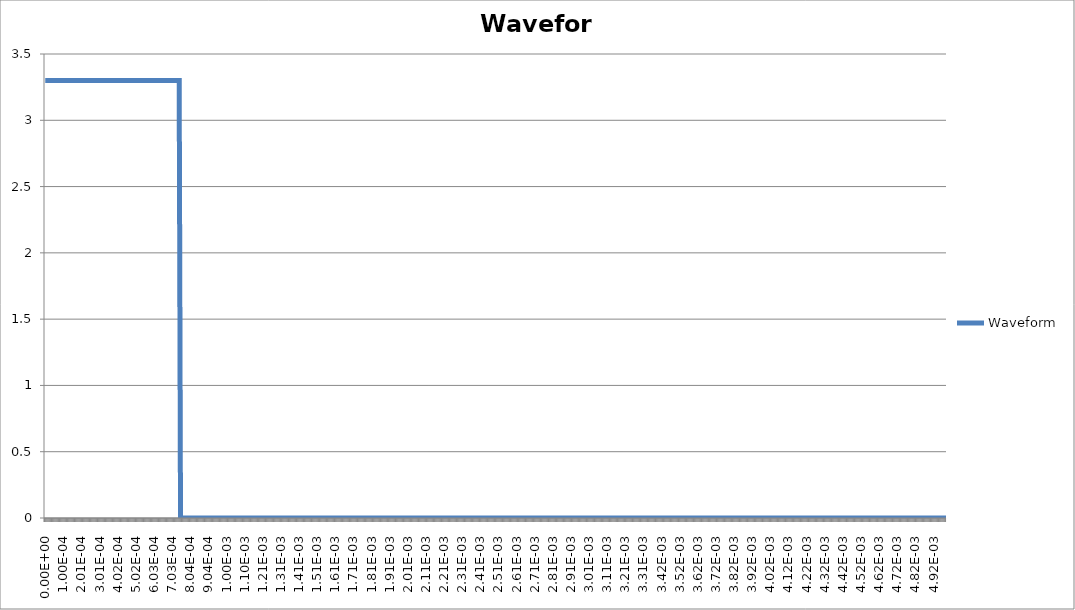
| Category | Waveform |
|---|---|
| 0.0 | 3.3 |
| 2.45e-06 | 3.3 |
| 4.9e-06 | 3.3 |
| 7.35e-06 | 3.3 |
| 9.8e-06 | 3.3 |
| 1.225e-05 | 3.3 |
| 1.47e-05 | 3.3 |
| 1.715e-05 | 3.3 |
| 1.96e-05 | 3.3 |
| 2.205e-05 | 3.3 |
| 2.45e-05 | 3.3 |
| 2.695e-05 | 3.3 |
| 2.94e-05 | 3.3 |
| 3.185e-05 | 3.3 |
| 3.43e-05 | 3.3 |
| 3.675e-05 | 3.3 |
| 3.92e-05 | 3.3 |
| 4.165e-05 | 3.3 |
| 4.41e-05 | 3.3 |
| 4.655e-05 | 3.3 |
| 4.9e-05 | 3.3 |
| 5.145e-05 | 3.3 |
| 5.39e-05 | 3.3 |
| 5.635e-05 | 3.3 |
| 5.88e-05 | 3.3 |
| 6.125e-05 | 3.3 |
| 6.37e-05 | 3.3 |
| 6.615e-05 | 3.3 |
| 6.86e-05 | 3.3 |
| 7.105e-05 | 3.3 |
| 7.35e-05 | 3.3 |
| 7.595e-05 | 3.3 |
| 7.84e-05 | 3.3 |
| 8.085e-05 | 3.3 |
| 8.33e-05 | 3.3 |
| 8.575e-05 | 3.3 |
| 8.82e-05 | 3.3 |
| 9.065e-05 | 3.3 |
| 9.31e-05 | 3.3 |
| 9.555e-05 | 3.3 |
| 9.8e-05 | 3.3 |
| 0.00010045 | 3.3 |
| 0.0001029 | 3.3 |
| 0.00010535 | 3.3 |
| 0.0001078 | 3.3 |
| 0.00011025 | 3.3 |
| 0.0001127 | 3.3 |
| 0.00011515 | 3.3 |
| 0.0001176 | 3.3 |
| 0.00012005 | 3.3 |
| 0.0001225 | 3.3 |
| 0.00012495 | 3.3 |
| 0.0001274 | 3.3 |
| 0.00012985 | 3.3 |
| 0.0001323 | 3.3 |
| 0.00013475 | 3.3 |
| 0.0001372 | 3.3 |
| 0.00013965 | 3.3 |
| 0.0001421 | 3.3 |
| 0.00014455 | 3.3 |
| 0.000147 | 3.3 |
| 0.00014945 | 3.3 |
| 0.0001519 | 3.3 |
| 0.00015435 | 3.3 |
| 0.0001568 | 3.3 |
| 0.00015925 | 3.3 |
| 0.0001617 | 3.3 |
| 0.00016415 | 3.3 |
| 0.0001666 | 3.3 |
| 0.00016905 | 3.3 |
| 0.0001715 | 3.3 |
| 0.00017395 | 3.3 |
| 0.0001764 | 3.3 |
| 0.00017885 | 3.3 |
| 0.0001813 | 3.3 |
| 0.00018375 | 3.3 |
| 0.0001862 | 3.3 |
| 0.00018865 | 3.3 |
| 0.0001911 | 3.3 |
| 0.00019355 | 3.3 |
| 0.000196 | 3.3 |
| 0.00019845 | 3.3 |
| 0.0002009 | 3.3 |
| 0.00020335 | 3.3 |
| 0.0002058 | 3.3 |
| 0.00020825 | 3.3 |
| 0.0002107 | 3.3 |
| 0.00021315 | 3.3 |
| 0.0002156 | 3.3 |
| 0.00021805 | 3.3 |
| 0.0002205 | 3.3 |
| 0.00022295 | 3.3 |
| 0.0002254 | 3.3 |
| 0.00022785 | 3.3 |
| 0.0002303 | 3.3 |
| 0.00023275 | 3.3 |
| 0.0002352 | 3.3 |
| 0.00023765 | 3.3 |
| 0.0002401 | 3.3 |
| 0.00024255 | 3.3 |
| 0.000245 | 3.3 |
| 0.00024745 | 3.3 |
| 0.0002499 | 3.3 |
| 0.00025235 | 3.3 |
| 0.0002548 | 3.3 |
| 0.00025725 | 3.3 |
| 0.0002597 | 3.3 |
| 0.00026215 | 3.3 |
| 0.0002646 | 3.3 |
| 0.00026705 | 3.3 |
| 0.0002695 | 3.3 |
| 0.00027195 | 3.3 |
| 0.0002744 | 3.3 |
| 0.00027685 | 3.3 |
| 0.0002793 | 3.3 |
| 0.00028175 | 3.3 |
| 0.0002842 | 3.3 |
| 0.00028665 | 3.3 |
| 0.0002891 | 3.3 |
| 0.00029155 | 3.3 |
| 0.000294 | 3.3 |
| 0.00029645 | 3.3 |
| 0.0002989 | 3.3 |
| 0.00030135 | 3.3 |
| 0.0003038 | 3.3 |
| 0.00030625 | 3.3 |
| 0.0003087 | 3.3 |
| 0.00031115 | 3.3 |
| 0.0003136 | 3.3 |
| 0.00031605 | 3.3 |
| 0.0003185 | 3.3 |
| 0.00032095 | 3.3 |
| 0.0003234 | 3.3 |
| 0.00032585 | 3.3 |
| 0.0003283 | 3.3 |
| 0.00033075 | 3.3 |
| 0.0003332 | 3.3 |
| 0.00033565 | 3.3 |
| 0.0003381 | 3.3 |
| 0.00034055 | 3.3 |
| 0.000343 | 3.3 |
| 0.00034545 | 3.3 |
| 0.0003479 | 3.3 |
| 0.00035035 | 3.3 |
| 0.0003528 | 3.3 |
| 0.00035525 | 3.3 |
| 0.0003577 | 3.3 |
| 0.00036015 | 3.3 |
| 0.0003626 | 3.3 |
| 0.00036505 | 3.3 |
| 0.0003675 | 3.3 |
| 0.00036995 | 3.3 |
| 0.0003724 | 3.3 |
| 0.00037485 | 3.3 |
| 0.0003773 | 3.3 |
| 0.00037975 | 3.3 |
| 0.0003822 | 3.3 |
| 0.00038465 | 3.3 |
| 0.0003871 | 3.3 |
| 0.00038955 | 3.3 |
| 0.000392 | 3.3 |
| 0.00039445 | 3.3 |
| 0.0003969 | 3.3 |
| 0.00039935 | 3.3 |
| 0.0004018 | 3.3 |
| 0.00040425 | 3.3 |
| 0.0004067 | 3.3 |
| 0.00040915 | 3.3 |
| 0.0004116 | 3.3 |
| 0.00041405 | 3.3 |
| 0.0004165 | 3.3 |
| 0.00041895 | 3.3 |
| 0.0004214 | 3.3 |
| 0.00042385 | 3.3 |
| 0.0004263 | 3.3 |
| 0.00042875 | 3.3 |
| 0.0004312 | 3.3 |
| 0.00043365 | 3.3 |
| 0.0004361 | 3.3 |
| 0.00043855 | 3.3 |
| 0.000441 | 3.3 |
| 0.00044345 | 3.3 |
| 0.0004459 | 3.3 |
| 0.00044835 | 3.3 |
| 0.0004508 | 3.3 |
| 0.00045325 | 3.3 |
| 0.0004557 | 3.3 |
| 0.00045815 | 3.3 |
| 0.0004606 | 3.3 |
| 0.00046305 | 3.3 |
| 0.0004655 | 3.3 |
| 0.00046795 | 3.3 |
| 0.0004704 | 3.3 |
| 0.00047285 | 3.3 |
| 0.0004753 | 3.3 |
| 0.00047775 | 3.3 |
| 0.0004802 | 3.3 |
| 0.00048265 | 3.3 |
| 0.0004851 | 3.3 |
| 0.00048755 | 3.3 |
| 0.00049 | 3.3 |
| 0.00049245 | 3.3 |
| 0.0004949 | 3.3 |
| 0.00049735 | 3.3 |
| 0.0004998 | 3.3 |
| 0.00050225 | 3.3 |
| 0.0005047 | 3.3 |
| 0.00050715 | 3.3 |
| 0.0005096 | 3.3 |
| 0.00051205 | 3.3 |
| 0.0005145 | 3.3 |
| 0.00051695 | 3.3 |
| 0.0005194 | 3.3 |
| 0.00052185 | 3.3 |
| 0.0005243 | 3.3 |
| 0.00052675 | 3.3 |
| 0.0005292 | 3.3 |
| 0.00053165 | 3.3 |
| 0.0005341 | 3.3 |
| 0.00053655 | 3.3 |
| 0.000539 | 3.3 |
| 0.00054145 | 3.3 |
| 0.0005439 | 3.3 |
| 0.00054635 | 3.3 |
| 0.0005488 | 3.3 |
| 0.00055125 | 3.3 |
| 0.0005537 | 3.3 |
| 0.00055615 | 3.3 |
| 0.0005586 | 3.3 |
| 0.00056105 | 3.3 |
| 0.0005635 | 3.3 |
| 0.00056595 | 3.3 |
| 0.0005684 | 3.3 |
| 0.00057085 | 3.3 |
| 0.0005733 | 3.3 |
| 0.00057575 | 3.3 |
| 0.0005782 | 3.3 |
| 0.00058065 | 3.3 |
| 0.0005831 | 3.3 |
| 0.00058555 | 3.3 |
| 0.000588 | 3.3 |
| 0.00059045 | 3.3 |
| 0.0005929 | 3.3 |
| 0.00059535 | 3.3 |
| 0.0005978 | 3.3 |
| 0.00060025 | 3.3 |
| 0.0006027 | 3.3 |
| 0.00060515 | 3.3 |
| 0.0006076 | 3.3 |
| 0.00061005 | 3.3 |
| 0.0006125 | 3.3 |
| 0.00061495 | 3.3 |
| 0.0006174 | 3.3 |
| 0.00061985 | 3.3 |
| 0.0006223 | 3.3 |
| 0.00062475 | 3.3 |
| 0.0006272 | 3.3 |
| 0.00062965 | 3.3 |
| 0.0006321 | 3.3 |
| 0.00063455 | 3.3 |
| 0.000637 | 3.3 |
| 0.00063945 | 3.3 |
| 0.0006419 | 3.3 |
| 0.00064435 | 3.3 |
| 0.0006468 | 3.3 |
| 0.00064925 | 3.3 |
| 0.0006517 | 3.3 |
| 0.00065415 | 3.3 |
| 0.0006566 | 3.3 |
| 0.00065905 | 3.3 |
| 0.0006615 | 3.3 |
| 0.00066395 | 3.3 |
| 0.0006664 | 3.3 |
| 0.00066885 | 3.3 |
| 0.0006713 | 3.3 |
| 0.00067375 | 3.3 |
| 0.0006762 | 3.3 |
| 0.00067865 | 3.3 |
| 0.0006811 | 3.3 |
| 0.00068355 | 3.3 |
| 0.000686 | 3.3 |
| 0.00068845 | 3.3 |
| 0.0006909 | 3.3 |
| 0.00069335 | 3.3 |
| 0.0006958 | 3.3 |
| 0.00069825 | 3.3 |
| 0.0007007 | 3.3 |
| 0.00070315 | 3.3 |
| 0.0007056 | 3.3 |
| 0.00070805 | 3.3 |
| 0.0007105 | 3.3 |
| 0.00071295 | 3.3 |
| 0.0007154 | 3.3 |
| 0.00071785 | 3.3 |
| 0.0007203 | 3.3 |
| 0.00072275 | 3.3 |
| 0.0007252 | 3.3 |
| 0.00072765 | 3.3 |
| 0.0007301 | 3.3 |
| 0.00073255 | 3.3 |
| 0.000735 | 3.3 |
| 0.00073745 | 3.3 |
| 0.0007399 | 3.3 |
| 0.00074235 | 3.3 |
| 0.0007448 | 3.3 |
| 0.00074725 | 3.3 |
| 0.0007497 | 0 |
| 0.00075215 | 0 |
| 0.0007546 | 0 |
| 0.00075705 | 0 |
| 0.0007595 | 0 |
| 0.00076195 | 0 |
| 0.0007644 | 0 |
| 0.00076685 | 0 |
| 0.0007693 | 0 |
| 0.00077175 | 0 |
| 0.0007742 | 0 |
| 0.00077665 | 0 |
| 0.0007791 | 0 |
| 0.00078155 | 0 |
| 0.000784 | 0 |
| 0.00078645 | 0 |
| 0.0007889 | 0 |
| 0.00079135 | 0 |
| 0.0007938 | 0 |
| 0.00079625 | 0 |
| 0.0007987 | 0 |
| 0.00080115 | 0 |
| 0.0008036 | 0 |
| 0.00080605 | 0 |
| 0.0008085 | 0 |
| 0.00081095 | 0 |
| 0.0008134 | 0 |
| 0.00081585 | 0 |
| 0.0008183 | 0 |
| 0.00082075 | 0 |
| 0.0008232 | 0 |
| 0.00082565 | 0 |
| 0.0008281 | 0 |
| 0.00083055 | 0 |
| 0.000833 | 0 |
| 0.00083545 | 0 |
| 0.0008379 | 0 |
| 0.00084035 | 0 |
| 0.0008428 | 0 |
| 0.00084525 | 0 |
| 0.0008477 | 0 |
| 0.00085015 | 0 |
| 0.0008526 | 0 |
| 0.00085505 | 0 |
| 0.0008575 | 0 |
| 0.00085995 | 0 |
| 0.0008624 | 0 |
| 0.00086485 | 0 |
| 0.0008673 | 0 |
| 0.00086975 | 0 |
| 0.0008722 | 0 |
| 0.00087465 | 0 |
| 0.0008771 | 0 |
| 0.00087955 | 0 |
| 0.000882 | 0 |
| 0.00088445 | 0 |
| 0.0008869 | 0 |
| 0.00088935 | 0 |
| 0.0008918 | 0 |
| 0.00089425 | 0 |
| 0.0008967 | 0 |
| 0.00089915 | 0 |
| 0.0009016 | 0 |
| 0.00090405 | 0 |
| 0.0009065 | 0 |
| 0.00090895 | 0 |
| 0.0009114 | 0 |
| 0.00091385 | 0 |
| 0.0009163 | 0 |
| 0.00091875 | 0 |
| 0.0009212 | 0 |
| 0.00092365 | 0 |
| 0.0009261 | 0 |
| 0.00092855 | 0 |
| 0.000931 | 0 |
| 0.00093345 | 0 |
| 0.0009359 | 0 |
| 0.00093835 | 0 |
| 0.0009408 | 0 |
| 0.00094325 | 0 |
| 0.0009457 | 0 |
| 0.00094815 | 0 |
| 0.0009506 | 0 |
| 0.00095305 | 0 |
| 0.0009555 | 0 |
| 0.00095795 | 0 |
| 0.0009604 | 0 |
| 0.00096285 | 0 |
| 0.0009653 | 0 |
| 0.00096775 | 0 |
| 0.0009702 | 0 |
| 0.00097265 | 0 |
| 0.0009751 | 0 |
| 0.00097755 | 0 |
| 0.00098 | 0 |
| 0.00098245 | 0 |
| 0.0009849 | 0 |
| 0.00098735 | 0 |
| 0.0009898 | 0 |
| 0.00099225 | 0 |
| 0.0009947 | 0 |
| 0.00099715 | 0 |
| 0.0009996 | 0 |
| 0.00100205 | 0 |
| 0.0010045 | 0 |
| 0.00100695 | 0 |
| 0.0010094 | 0 |
| 0.00101185 | 0 |
| 0.0010143 | 0 |
| 0.00101675 | 0 |
| 0.0010192 | 0 |
| 0.00102165 | 0 |
| 0.0010241 | 0 |
| 0.00102655 | 0 |
| 0.001029 | 0 |
| 0.00103145 | 0 |
| 0.0010339 | 0 |
| 0.00103635 | 0 |
| 0.0010388 | 0 |
| 0.00104125 | 0 |
| 0.0010437 | 0 |
| 0.00104615 | 0 |
| 0.0010486 | 0 |
| 0.00105105 | 0 |
| 0.0010535 | 0 |
| 0.00105595 | 0 |
| 0.0010584 | 0 |
| 0.00106085 | 0 |
| 0.0010633 | 0 |
| 0.00106575 | 0 |
| 0.0010682 | 0 |
| 0.00107065 | 0 |
| 0.0010731 | 0 |
| 0.00107555 | 0 |
| 0.001078 | 0 |
| 0.00108045 | 0 |
| 0.0010829 | 0 |
| 0.00108535 | 0 |
| 0.0010878 | 0 |
| 0.00109025 | 0 |
| 0.0010927 | 0 |
| 0.00109515 | 0 |
| 0.0010976 | 0 |
| 0.00110005 | 0 |
| 0.0011025 | 0 |
| 0.00110495 | 0 |
| 0.0011074 | 0 |
| 0.00110985 | 0 |
| 0.0011123 | 0 |
| 0.00111475 | 0 |
| 0.0011172 | 0 |
| 0.00111965 | 0 |
| 0.0011221 | 0 |
| 0.00112455 | 0 |
| 0.001127 | 0 |
| 0.00112945 | 0 |
| 0.0011319 | 0 |
| 0.00113435 | 0 |
| 0.0011368 | 0 |
| 0.00113925 | 0 |
| 0.0011417 | 0 |
| 0.00114415 | 0 |
| 0.0011466 | 0 |
| 0.00114905 | 0 |
| 0.0011515 | 0 |
| 0.00115395 | 0 |
| 0.0011564 | 0 |
| 0.00115885 | 0 |
| 0.0011613 | 0 |
| 0.00116375 | 0 |
| 0.0011662 | 0 |
| 0.00116865 | 0 |
| 0.0011711 | 0 |
| 0.00117355 | 0 |
| 0.001176 | 0 |
| 0.00117845 | 0 |
| 0.0011809 | 0 |
| 0.00118335 | 0 |
| 0.0011858 | 0 |
| 0.00118825 | 0 |
| 0.0011907 | 0 |
| 0.00119315 | 0 |
| 0.0011956 | 0 |
| 0.00119805 | 0 |
| 0.0012005 | 0 |
| 0.00120295 | 0 |
| 0.0012054 | 0 |
| 0.00120785 | 0 |
| 0.0012103 | 0 |
| 0.00121275 | 0 |
| 0.0012152 | 0 |
| 0.00121765 | 0 |
| 0.0012201 | 0 |
| 0.00122255 | 0 |
| 0.001225 | 0 |
| 0.00122745 | 0 |
| 0.0012299 | 0 |
| 0.00123235 | 0 |
| 0.0012348 | 0 |
| 0.00123725 | 0 |
| 0.0012397 | 0 |
| 0.00124215 | 0 |
| 0.0012446 | 0 |
| 0.00124705 | 0 |
| 0.0012495 | 0 |
| 0.00125195 | 0 |
| 0.0012544 | 0 |
| 0.00125685 | 0 |
| 0.0012593 | 0 |
| 0.00126175 | 0 |
| 0.0012642 | 0 |
| 0.00126665 | 0 |
| 0.0012691 | 0 |
| 0.00127155 | 0 |
| 0.001274 | 0 |
| 0.00127645 | 0 |
| 0.0012789 | 0 |
| 0.00128135 | 0 |
| 0.0012838 | 0 |
| 0.00128625 | 0 |
| 0.0012887 | 0 |
| 0.00129115 | 0 |
| 0.0012936 | 0 |
| 0.00129605 | 0 |
| 0.0012985 | 0 |
| 0.00130095 | 0 |
| 0.0013034 | 0 |
| 0.00130585 | 0 |
| 0.0013083 | 0 |
| 0.00131075 | 0 |
| 0.0013132 | 0 |
| 0.00131565 | 0 |
| 0.0013181 | 0 |
| 0.00132055 | 0 |
| 0.001323 | 0 |
| 0.00132545 | 0 |
| 0.0013279 | 0 |
| 0.00133035 | 0 |
| 0.0013328 | 0 |
| 0.00133525 | 0 |
| 0.0013377 | 0 |
| 0.00134015 | 0 |
| 0.0013426 | 0 |
| 0.00134505 | 0 |
| 0.0013475 | 0 |
| 0.00134995 | 0 |
| 0.0013524 | 0 |
| 0.00135485 | 0 |
| 0.0013573 | 0 |
| 0.00135975 | 0 |
| 0.0013622 | 0 |
| 0.00136465 | 0 |
| 0.0013671 | 0 |
| 0.00136955 | 0 |
| 0.001372 | 0 |
| 0.00137445 | 0 |
| 0.0013769 | 0 |
| 0.00137935 | 0 |
| 0.0013818 | 0 |
| 0.00138425 | 0 |
| 0.0013867 | 0 |
| 0.00138915 | 0 |
| 0.0013916 | 0 |
| 0.00139405 | 0 |
| 0.0013965 | 0 |
| 0.00139895 | 0 |
| 0.0014014 | 0 |
| 0.00140385 | 0 |
| 0.0014063 | 0 |
| 0.00140875 | 0 |
| 0.0014112 | 0 |
| 0.00141365 | 0 |
| 0.0014161 | 0 |
| 0.00141855 | 0 |
| 0.001421 | 0 |
| 0.00142345 | 0 |
| 0.0014259 | 0 |
| 0.00142835 | 0 |
| 0.0014308 | 0 |
| 0.00143325 | 0 |
| 0.0014357 | 0 |
| 0.00143815 | 0 |
| 0.0014406 | 0 |
| 0.00144305 | 0 |
| 0.0014455 | 0 |
| 0.00144795 | 0 |
| 0.0014504 | 0 |
| 0.00145285 | 0 |
| 0.0014553 | 0 |
| 0.00145775 | 0 |
| 0.0014602 | 0 |
| 0.00146265 | 0 |
| 0.0014651 | 0 |
| 0.00146755 | 0 |
| 0.00147 | 0 |
| 0.00147245 | 0 |
| 0.0014749 | 0 |
| 0.00147735 | 0 |
| 0.0014798 | 0 |
| 0.00148225 | 0 |
| 0.0014847 | 0 |
| 0.00148715 | 0 |
| 0.0014896 | 0 |
| 0.00149205 | 0 |
| 0.0014945 | 0 |
| 0.00149695 | 0 |
| 0.0014994 | 0 |
| 0.00150185 | 0 |
| 0.0015043 | 0 |
| 0.00150675 | 0 |
| 0.0015092 | 0 |
| 0.00151165 | 0 |
| 0.0015141 | 0 |
| 0.00151655 | 0 |
| 0.001519 | 0 |
| 0.00152145 | 0 |
| 0.0015239 | 0 |
| 0.00152635 | 0 |
| 0.0015288 | 0 |
| 0.00153125 | 0 |
| 0.0015337 | 0 |
| 0.00153615 | 0 |
| 0.0015386 | 0 |
| 0.00154105 | 0 |
| 0.0015435 | 0 |
| 0.00154595 | 0 |
| 0.0015484 | 0 |
| 0.00155085 | 0 |
| 0.0015533 | 0 |
| 0.00155575 | 0 |
| 0.0015582 | 0 |
| 0.00156065 | 0 |
| 0.0015631 | 0 |
| 0.00156555 | 0 |
| 0.001568 | 0 |
| 0.00157045 | 0 |
| 0.0015729 | 0 |
| 0.00157535 | 0 |
| 0.0015778 | 0 |
| 0.00158025 | 0 |
| 0.0015827 | 0 |
| 0.00158515 | 0 |
| 0.0015876 | 0 |
| 0.00159005 | 0 |
| 0.0015925 | 0 |
| 0.00159495 | 0 |
| 0.0015974 | 0 |
| 0.00159985 | 0 |
| 0.0016023 | 0 |
| 0.00160475 | 0 |
| 0.0016072 | 0 |
| 0.00160965 | 0 |
| 0.0016121 | 0 |
| 0.00161455 | 0 |
| 0.001617 | 0 |
| 0.00161945 | 0 |
| 0.0016219 | 0 |
| 0.00162435 | 0 |
| 0.0016268 | 0 |
| 0.00162925 | 0 |
| 0.0016317 | 0 |
| 0.00163415 | 0 |
| 0.0016366 | 0 |
| 0.00163905 | 0 |
| 0.0016415 | 0 |
| 0.00164395 | 0 |
| 0.0016464 | 0 |
| 0.00164885 | 0 |
| 0.0016513 | 0 |
| 0.00165375 | 0 |
| 0.0016562 | 0 |
| 0.00165865 | 0 |
| 0.0016611 | 0 |
| 0.00166355 | 0 |
| 0.001666 | 0 |
| 0.00166845 | 0 |
| 0.0016709 | 0 |
| 0.00167335 | 0 |
| 0.0016758 | 0 |
| 0.00167825 | 0 |
| 0.0016807 | 0 |
| 0.00168315 | 0 |
| 0.0016856 | 0 |
| 0.00168805 | 0 |
| 0.0016905 | 0 |
| 0.00169295 | 0 |
| 0.0016954 | 0 |
| 0.00169785 | 0 |
| 0.0017003 | 0 |
| 0.00170275 | 0 |
| 0.0017052 | 0 |
| 0.00170765 | 0 |
| 0.0017101 | 0 |
| 0.00171255 | 0 |
| 0.001715 | 0 |
| 0.00171745 | 0 |
| 0.0017199 | 0 |
| 0.00172235 | 0 |
| 0.0017248 | 0 |
| 0.00172725 | 0 |
| 0.0017297 | 0 |
| 0.00173215 | 0 |
| 0.0017346 | 0 |
| 0.00173705 | 0 |
| 0.0017395 | 0 |
| 0.00174195 | 0 |
| 0.0017444 | 0 |
| 0.00174685 | 0 |
| 0.0017493 | 0 |
| 0.00175175 | 0 |
| 0.0017542 | 0 |
| 0.00175665 | 0 |
| 0.0017591 | 0 |
| 0.00176155 | 0 |
| 0.001764 | 0 |
| 0.00176645 | 0 |
| 0.0017689 | 0 |
| 0.00177135 | 0 |
| 0.0017738 | 0 |
| 0.00177625 | 0 |
| 0.0017787 | 0 |
| 0.00178115 | 0 |
| 0.0017836 | 0 |
| 0.00178605 | 0 |
| 0.0017885 | 0 |
| 0.00179095 | 0 |
| 0.0017934 | 0 |
| 0.00179585 | 0 |
| 0.0017983 | 0 |
| 0.00180075 | 0 |
| 0.0018032 | 0 |
| 0.00180565 | 0 |
| 0.0018081 | 0 |
| 0.00181055 | 0 |
| 0.001813 | 0 |
| 0.00181545 | 0 |
| 0.0018179 | 0 |
| 0.00182035 | 0 |
| 0.0018228 | 0 |
| 0.00182525 | 0 |
| 0.0018277 | 0 |
| 0.00183015 | 0 |
| 0.0018326 | 0 |
| 0.00183505 | 0 |
| 0.0018375 | 0 |
| 0.00183995 | 0 |
| 0.0018424 | 0 |
| 0.00184485 | 0 |
| 0.0018473 | 0 |
| 0.00184975 | 0 |
| 0.0018522 | 0 |
| 0.00185465 | 0 |
| 0.0018571 | 0 |
| 0.00185955 | 0 |
| 0.001862 | 0 |
| 0.00186445 | 0 |
| 0.0018669 | 0 |
| 0.00186935 | 0 |
| 0.0018718 | 0 |
| 0.00187425 | 0 |
| 0.0018767 | 0 |
| 0.00187915 | 0 |
| 0.0018816 | 0 |
| 0.00188405 | 0 |
| 0.0018865 | 0 |
| 0.00188895 | 0 |
| 0.0018914 | 0 |
| 0.00189385 | 0 |
| 0.0018963 | 0 |
| 0.00189875 | 0 |
| 0.0019012 | 0 |
| 0.00190365 | 0 |
| 0.0019061 | 0 |
| 0.00190855 | 0 |
| 0.001911 | 0 |
| 0.00191345 | 0 |
| 0.0019159 | 0 |
| 0.00191835 | 0 |
| 0.0019208 | 0 |
| 0.00192325 | 0 |
| 0.0019257 | 0 |
| 0.00192815 | 0 |
| 0.0019306 | 0 |
| 0.00193305 | 0 |
| 0.0019355 | 0 |
| 0.00193795 | 0 |
| 0.0019404 | 0 |
| 0.00194285 | 0 |
| 0.0019453 | 0 |
| 0.00194775 | 0 |
| 0.0019502 | 0 |
| 0.00195265 | 0 |
| 0.0019551 | 0 |
| 0.00195755 | 0 |
| 0.00196 | 0 |
| 0.00196245 | 0 |
| 0.0019649 | 0 |
| 0.00196735 | 0 |
| 0.0019698 | 0 |
| 0.00197225 | 0 |
| 0.0019747 | 0 |
| 0.00197715 | 0 |
| 0.0019796 | 0 |
| 0.00198205 | 0 |
| 0.0019845 | 0 |
| 0.00198695 | 0 |
| 0.0019894 | 0 |
| 0.00199185 | 0 |
| 0.0019943 | 0 |
| 0.00199675 | 0 |
| 0.0019992 | 0 |
| 0.00200165 | 0 |
| 0.0020041 | 0 |
| 0.00200655 | 0 |
| 0.002009 | 0 |
| 0.00201145 | 0 |
| 0.0020139 | 0 |
| 0.00201635 | 0 |
| 0.0020188 | 0 |
| 0.00202125 | 0 |
| 0.0020237 | 0 |
| 0.00202615 | 0 |
| 0.0020286 | 0 |
| 0.00203105 | 0 |
| 0.0020335 | 0 |
| 0.00203595 | 0 |
| 0.0020384 | 0 |
| 0.00204085 | 0 |
| 0.0020433 | 0 |
| 0.00204575 | 0 |
| 0.0020482 | 0 |
| 0.00205065 | 0 |
| 0.0020531 | 0 |
| 0.00205555 | 0 |
| 0.002058 | 0 |
| 0.00206045 | 0 |
| 0.0020629 | 0 |
| 0.00206535 | 0 |
| 0.0020678 | 0 |
| 0.00207025 | 0 |
| 0.0020727 | 0 |
| 0.00207515 | 0 |
| 0.0020776 | 0 |
| 0.00208005 | 0 |
| 0.0020825 | 0 |
| 0.00208495 | 0 |
| 0.0020874 | 0 |
| 0.00208985 | 0 |
| 0.0020923 | 0 |
| 0.00209475 | 0 |
| 0.0020972 | 0 |
| 0.00209965 | 0 |
| 0.0021021 | 0 |
| 0.00210455 | 0 |
| 0.002107 | 0 |
| 0.00210945 | 0 |
| 0.0021119 | 0 |
| 0.00211435 | 0 |
| 0.0021168 | 0 |
| 0.00211925 | 0 |
| 0.0021217 | 0 |
| 0.00212415 | 0 |
| 0.0021266 | 0 |
| 0.00212905 | 0 |
| 0.0021315 | 0 |
| 0.00213395 | 0 |
| 0.0021364 | 0 |
| 0.00213885 | 0 |
| 0.0021413 | 0 |
| 0.00214375 | 0 |
| 0.0021462 | 0 |
| 0.00214865 | 0 |
| 0.0021511 | 0 |
| 0.00215355 | 0 |
| 0.002156 | 0 |
| 0.00215845 | 0 |
| 0.0021609 | 0 |
| 0.00216335 | 0 |
| 0.0021658 | 0 |
| 0.00216825 | 0 |
| 0.0021707 | 0 |
| 0.00217315 | 0 |
| 0.0021756 | 0 |
| 0.00217805 | 0 |
| 0.0021805 | 0 |
| 0.00218295 | 0 |
| 0.0021854 | 0 |
| 0.00218785 | 0 |
| 0.0021903 | 0 |
| 0.00219275 | 0 |
| 0.0021952 | 0 |
| 0.00219765 | 0 |
| 0.0022001 | 0 |
| 0.00220255 | 0 |
| 0.002205 | 0 |
| 0.00220745 | 0 |
| 0.0022099 | 0 |
| 0.00221235 | 0 |
| 0.0022148 | 0 |
| 0.00221725 | 0 |
| 0.0022197 | 0 |
| 0.00222215 | 0 |
| 0.0022246 | 0 |
| 0.00222705 | 0 |
| 0.0022295 | 0 |
| 0.00223195 | 0 |
| 0.0022344 | 0 |
| 0.00223685 | 0 |
| 0.0022393 | 0 |
| 0.00224175 | 0 |
| 0.0022442 | 0 |
| 0.00224665 | 0 |
| 0.0022491 | 0 |
| 0.00225155 | 0 |
| 0.002254 | 0 |
| 0.00225645 | 0 |
| 0.0022589 | 0 |
| 0.00226135 | 0 |
| 0.0022638 | 0 |
| 0.00226625 | 0 |
| 0.0022687 | 0 |
| 0.00227115 | 0 |
| 0.0022736 | 0 |
| 0.00227605 | 0 |
| 0.0022785 | 0 |
| 0.00228095 | 0 |
| 0.0022834 | 0 |
| 0.00228585 | 0 |
| 0.0022883 | 0 |
| 0.00229075 | 0 |
| 0.0022932 | 0 |
| 0.00229565 | 0 |
| 0.0022981 | 0 |
| 0.00230055 | 0 |
| 0.002303 | 0 |
| 0.00230545 | 0 |
| 0.0023079 | 0 |
| 0.00231035 | 0 |
| 0.0023128 | 0 |
| 0.00231525 | 0 |
| 0.0023177 | 0 |
| 0.00232015 | 0 |
| 0.0023226 | 0 |
| 0.00232505 | 0 |
| 0.0023275 | 0 |
| 0.00232995 | 0 |
| 0.0023324 | 0 |
| 0.00233485 | 0 |
| 0.0023373 | 0 |
| 0.00233975 | 0 |
| 0.0023422 | 0 |
| 0.00234465 | 0 |
| 0.0023471 | 0 |
| 0.00234955 | 0 |
| 0.002352 | 0 |
| 0.00235445 | 0 |
| 0.0023569 | 0 |
| 0.00235935 | 0 |
| 0.0023618 | 0 |
| 0.00236425 | 0 |
| 0.0023667 | 0 |
| 0.00236915 | 0 |
| 0.0023716 | 0 |
| 0.00237405 | 0 |
| 0.0023765 | 0 |
| 0.00237895 | 0 |
| 0.0023814 | 0 |
| 0.00238385 | 0 |
| 0.0023863 | 0 |
| 0.00238875 | 0 |
| 0.0023912 | 0 |
| 0.00239365 | 0 |
| 0.0023961 | 0 |
| 0.00239855 | 0 |
| 0.002401 | 0 |
| 0.00240345 | 0 |
| 0.0024059 | 0 |
| 0.00240835 | 0 |
| 0.0024108 | 0 |
| 0.00241325 | 0 |
| 0.0024157 | 0 |
| 0.00241815 | 0 |
| 0.0024206 | 0 |
| 0.00242305 | 0 |
| 0.0024255 | 0 |
| 0.00242795 | 0 |
| 0.0024304 | 0 |
| 0.00243285 | 0 |
| 0.0024353 | 0 |
| 0.00243775 | 0 |
| 0.0024402 | 0 |
| 0.00244265 | 0 |
| 0.0024451 | 0 |
| 0.00244755 | 0 |
| 0.00245 | 0 |
| 0.00245245 | 0 |
| 0.0024549 | 0 |
| 0.00245735 | 0 |
| 0.0024598 | 0 |
| 0.00246225 | 0 |
| 0.0024647 | 0 |
| 0.00246715 | 0 |
| 0.0024696 | 0 |
| 0.00247205 | 0 |
| 0.0024745 | 0 |
| 0.00247695 | 0 |
| 0.0024794 | 0 |
| 0.00248185 | 0 |
| 0.0024843 | 0 |
| 0.00248675 | 0 |
| 0.0024892 | 0 |
| 0.00249165 | 0 |
| 0.0024941 | 0 |
| 0.00249655 | 0 |
| 0.002499 | 0 |
| 0.00250145 | 0 |
| 0.0025039 | 0 |
| 0.00250635 | 0 |
| 0.0025088 | 0 |
| 0.00251125 | 0 |
| 0.0025137 | 0 |
| 0.00251615 | 0 |
| 0.0025186 | 0 |
| 0.00252105 | 0 |
| 0.0025235 | 0 |
| 0.00252595 | 0 |
| 0.0025284 | 0 |
| 0.00253085 | 0 |
| 0.0025333 | 0 |
| 0.00253575 | 0 |
| 0.0025382 | 0 |
| 0.00254065 | 0 |
| 0.0025431 | 0 |
| 0.00254555 | 0 |
| 0.002548 | 0 |
| 0.00255045 | 0 |
| 0.0025529 | 0 |
| 0.00255535 | 0 |
| 0.0025578 | 0 |
| 0.00256025 | 0 |
| 0.0025627 | 0 |
| 0.00256515 | 0 |
| 0.0025676 | 0 |
| 0.00257005 | 0 |
| 0.0025725 | 0 |
| 0.00257495 | 0 |
| 0.0025774 | 0 |
| 0.00257985 | 0 |
| 0.0025823 | 0 |
| 0.00258475 | 0 |
| 0.0025872 | 0 |
| 0.00258965 | 0 |
| 0.0025921 | 0 |
| 0.00259455 | 0 |
| 0.002597 | 0 |
| 0.00259945 | 0 |
| 0.0026019 | 0 |
| 0.00260435 | 0 |
| 0.0026068 | 0 |
| 0.00260925 | 0 |
| 0.0026117 | 0 |
| 0.00261415 | 0 |
| 0.0026166 | 0 |
| 0.00261905 | 0 |
| 0.0026215 | 0 |
| 0.00262395 | 0 |
| 0.0026264 | 0 |
| 0.00262885 | 0 |
| 0.0026313 | 0 |
| 0.00263375 | 0 |
| 0.0026362 | 0 |
| 0.00263865 | 0 |
| 0.0026411 | 0 |
| 0.00264355 | 0 |
| 0.002646 | 0 |
| 0.00264845 | 0 |
| 0.0026509 | 0 |
| 0.00265335 | 0 |
| 0.0026558 | 0 |
| 0.00265825 | 0 |
| 0.0026607 | 0 |
| 0.00266315 | 0 |
| 0.0026656 | 0 |
| 0.00266805 | 0 |
| 0.0026705 | 0 |
| 0.00267295 | 0 |
| 0.0026754 | 0 |
| 0.00267785 | 0 |
| 0.0026803 | 0 |
| 0.00268275 | 0 |
| 0.0026852 | 0 |
| 0.00268765 | 0 |
| 0.0026901 | 0 |
| 0.00269255 | 0 |
| 0.002695 | 0 |
| 0.00269745 | 0 |
| 0.0026999 | 0 |
| 0.00270235 | 0 |
| 0.0027048 | 0 |
| 0.00270725 | 0 |
| 0.0027097 | 0 |
| 0.00271215 | 0 |
| 0.0027146 | 0 |
| 0.00271705 | 0 |
| 0.0027195 | 0 |
| 0.00272195 | 0 |
| 0.0027244 | 0 |
| 0.00272685 | 0 |
| 0.0027293 | 0 |
| 0.00273175 | 0 |
| 0.0027342 | 0 |
| 0.00273665 | 0 |
| 0.0027391 | 0 |
| 0.00274155 | 0 |
| 0.002744 | 0 |
| 0.00274645 | 0 |
| 0.0027489 | 0 |
| 0.00275135 | 0 |
| 0.0027538 | 0 |
| 0.00275625 | 0 |
| 0.0027587 | 0 |
| 0.00276115 | 0 |
| 0.0027636 | 0 |
| 0.00276605 | 0 |
| 0.0027685 | 0 |
| 0.00277095 | 0 |
| 0.0027734 | 0 |
| 0.00277585 | 0 |
| 0.0027783 | 0 |
| 0.00278075 | 0 |
| 0.0027832 | 0 |
| 0.00278565 | 0 |
| 0.0027881 | 0 |
| 0.00279055 | 0 |
| 0.002793 | 0 |
| 0.00279545 | 0 |
| 0.0027979 | 0 |
| 0.00280035 | 0 |
| 0.0028028 | 0 |
| 0.00280525 | 0 |
| 0.0028077 | 0 |
| 0.00281015 | 0 |
| 0.0028126 | 0 |
| 0.00281505 | 0 |
| 0.0028175 | 0 |
| 0.00281995 | 0 |
| 0.0028224 | 0 |
| 0.00282485 | 0 |
| 0.0028273 | 0 |
| 0.00282975 | 0 |
| 0.0028322 | 0 |
| 0.00283465 | 0 |
| 0.0028371 | 0 |
| 0.00283955 | 0 |
| 0.002842 | 0 |
| 0.00284445 | 0 |
| 0.0028469 | 0 |
| 0.00284935 | 0 |
| 0.0028518 | 0 |
| 0.00285425 | 0 |
| 0.0028567 | 0 |
| 0.00285915 | 0 |
| 0.0028616 | 0 |
| 0.00286405 | 0 |
| 0.0028665 | 0 |
| 0.00286895 | 0 |
| 0.0028714 | 0 |
| 0.00287385 | 0 |
| 0.0028763 | 0 |
| 0.00287875 | 0 |
| 0.0028812 | 0 |
| 0.00288365 | 0 |
| 0.0028861 | 0 |
| 0.00288855 | 0 |
| 0.002891 | 0 |
| 0.00289345 | 0 |
| 0.0028959 | 0 |
| 0.00289835 | 0 |
| 0.0029008 | 0 |
| 0.00290325 | 0 |
| 0.0029057 | 0 |
| 0.00290815 | 0 |
| 0.0029106 | 0 |
| 0.00291305 | 0 |
| 0.0029155 | 0 |
| 0.00291795 | 0 |
| 0.0029204 | 0 |
| 0.00292285 | 0 |
| 0.0029253 | 0 |
| 0.00292775 | 0 |
| 0.0029302 | 0 |
| 0.00293265 | 0 |
| 0.0029351 | 0 |
| 0.00293755 | 0 |
| 0.00294 | 0 |
| 0.00294245 | 0 |
| 0.0029449 | 0 |
| 0.00294735 | 0 |
| 0.0029498 | 0 |
| 0.00295225 | 0 |
| 0.0029547 | 0 |
| 0.00295715 | 0 |
| 0.0029596 | 0 |
| 0.00296205 | 0 |
| 0.0029645 | 0 |
| 0.00296695 | 0 |
| 0.0029694 | 0 |
| 0.00297185 | 0 |
| 0.0029743 | 0 |
| 0.00297675 | 0 |
| 0.0029792 | 0 |
| 0.00298165 | 0 |
| 0.0029841 | 0 |
| 0.00298655 | 0 |
| 0.002989 | 0 |
| 0.00299145 | 0 |
| 0.0029939 | 0 |
| 0.00299635 | 0 |
| 0.0029988 | 0 |
| 0.00300125 | 0 |
| 0.0030037 | 0 |
| 0.00300615 | 0 |
| 0.0030086 | 0 |
| 0.00301105 | 0 |
| 0.0030135 | 0 |
| 0.00301595 | 0 |
| 0.0030184 | 0 |
| 0.00302085 | 0 |
| 0.0030233 | 0 |
| 0.00302575 | 0 |
| 0.0030282 | 0 |
| 0.00303065 | 0 |
| 0.0030331 | 0 |
| 0.00303555 | 0 |
| 0.003038 | 0 |
| 0.00304045 | 0 |
| 0.0030429 | 0 |
| 0.00304535 | 0 |
| 0.0030478 | 0 |
| 0.00305025 | 0 |
| 0.0030527 | 0 |
| 0.00305515 | 0 |
| 0.0030576 | 0 |
| 0.00306005 | 0 |
| 0.0030625 | 0 |
| 0.00306495 | 0 |
| 0.0030674 | 0 |
| 0.00306985 | 0 |
| 0.0030723 | 0 |
| 0.00307475 | 0 |
| 0.0030772 | 0 |
| 0.00307965 | 0 |
| 0.0030821 | 0 |
| 0.00308455 | 0 |
| 0.003087 | 0 |
| 0.00308945 | 0 |
| 0.0030919 | 0 |
| 0.00309435 | 0 |
| 0.0030968 | 0 |
| 0.00309925 | 0 |
| 0.0031017 | 0 |
| 0.00310415 | 0 |
| 0.0031066 | 0 |
| 0.00310905 | 0 |
| 0.0031115 | 0 |
| 0.00311395 | 0 |
| 0.0031164 | 0 |
| 0.00311885 | 0 |
| 0.0031213 | 0 |
| 0.00312375 | 0 |
| 0.0031262 | 0 |
| 0.00312865 | 0 |
| 0.0031311 | 0 |
| 0.00313355 | 0 |
| 0.003136 | 0 |
| 0.00313845 | 0 |
| 0.0031409 | 0 |
| 0.00314335 | 0 |
| 0.0031458 | 0 |
| 0.00314825 | 0 |
| 0.0031507 | 0 |
| 0.00315315 | 0 |
| 0.0031556 | 0 |
| 0.00315805 | 0 |
| 0.0031605 | 0 |
| 0.00316295 | 0 |
| 0.0031654 | 0 |
| 0.00316785 | 0 |
| 0.0031703 | 0 |
| 0.00317275 | 0 |
| 0.0031752 | 0 |
| 0.00317765 | 0 |
| 0.0031801 | 0 |
| 0.00318255 | 0 |
| 0.003185 | 0 |
| 0.00318745 | 0 |
| 0.0031899 | 0 |
| 0.00319235 | 0 |
| 0.0031948 | 0 |
| 0.00319725 | 0 |
| 0.0031997 | 0 |
| 0.00320215 | 0 |
| 0.0032046 | 0 |
| 0.00320705 | 0 |
| 0.0032095 | 0 |
| 0.00321195 | 0 |
| 0.0032144 | 0 |
| 0.00321685 | 0 |
| 0.0032193 | 0 |
| 0.00322175 | 0 |
| 0.0032242 | 0 |
| 0.00322665 | 0 |
| 0.0032291 | 0 |
| 0.00323155 | 0 |
| 0.003234 | 0 |
| 0.00323645 | 0 |
| 0.0032389 | 0 |
| 0.00324135 | 0 |
| 0.0032438 | 0 |
| 0.00324625 | 0 |
| 0.0032487 | 0 |
| 0.00325115 | 0 |
| 0.0032536 | 0 |
| 0.00325605 | 0 |
| 0.0032585 | 0 |
| 0.00326095 | 0 |
| 0.0032634 | 0 |
| 0.00326585 | 0 |
| 0.0032683 | 0 |
| 0.00327075 | 0 |
| 0.0032732 | 0 |
| 0.00327565 | 0 |
| 0.0032781 | 0 |
| 0.00328055 | 0 |
| 0.003283 | 0 |
| 0.00328545 | 0 |
| 0.0032879 | 0 |
| 0.00329035 | 0 |
| 0.0032928 | 0 |
| 0.00329525 | 0 |
| 0.0032977 | 0 |
| 0.00330015 | 0 |
| 0.0033026 | 0 |
| 0.00330505 | 0 |
| 0.0033075 | 0 |
| 0.00330995 | 0 |
| 0.0033124 | 0 |
| 0.00331485 | 0 |
| 0.0033173 | 0 |
| 0.00331975 | 0 |
| 0.0033222 | 0 |
| 0.00332465 | 0 |
| 0.0033271 | 0 |
| 0.00332955 | 0 |
| 0.003332 | 0 |
| 0.00333445 | 0 |
| 0.0033369 | 0 |
| 0.00333935 | 0 |
| 0.0033418 | 0 |
| 0.00334425 | 0 |
| 0.0033467 | 0 |
| 0.00334915 | 0 |
| 0.0033516 | 0 |
| 0.00335405 | 0 |
| 0.0033565 | 0 |
| 0.00335895 | 0 |
| 0.0033614 | 0 |
| 0.00336385 | 0 |
| 0.0033663 | 0 |
| 0.00336875 | 0 |
| 0.0033712 | 0 |
| 0.00337365 | 0 |
| 0.0033761 | 0 |
| 0.00337855 | 0 |
| 0.003381 | 0 |
| 0.00338345 | 0 |
| 0.0033859 | 0 |
| 0.00338835 | 0 |
| 0.0033908 | 0 |
| 0.00339325 | 0 |
| 0.0033957 | 0 |
| 0.00339815 | 0 |
| 0.0034006 | 0 |
| 0.00340305 | 0 |
| 0.0034055 | 0 |
| 0.00340795 | 0 |
| 0.0034104 | 0 |
| 0.00341285 | 0 |
| 0.0034153 | 0 |
| 0.00341775 | 0 |
| 0.0034202 | 0 |
| 0.00342265 | 0 |
| 0.0034251 | 0 |
| 0.00342755 | 0 |
| 0.00343 | 0 |
| 0.00343245 | 0 |
| 0.0034349 | 0 |
| 0.00343735 | 0 |
| 0.0034398 | 0 |
| 0.00344225 | 0 |
| 0.0034447 | 0 |
| 0.00344715 | 0 |
| 0.0034496 | 0 |
| 0.00345205 | 0 |
| 0.0034545 | 0 |
| 0.00345695 | 0 |
| 0.0034594 | 0 |
| 0.00346185 | 0 |
| 0.0034643 | 0 |
| 0.00346675 | 0 |
| 0.0034692 | 0 |
| 0.00347165 | 0 |
| 0.0034741 | 0 |
| 0.00347655 | 0 |
| 0.003479 | 0 |
| 0.00348145 | 0 |
| 0.0034839 | 0 |
| 0.00348635 | 0 |
| 0.0034888 | 0 |
| 0.00349125 | 0 |
| 0.0034937 | 0 |
| 0.00349615 | 0 |
| 0.0034986 | 0 |
| 0.00350105 | 0 |
| 0.0035035 | 0 |
| 0.00350595 | 0 |
| 0.0035084 | 0 |
| 0.00351085 | 0 |
| 0.0035133 | 0 |
| 0.00351575 | 0 |
| 0.0035182 | 0 |
| 0.00352065 | 0 |
| 0.0035231 | 0 |
| 0.00352555 | 0 |
| 0.003528 | 0 |
| 0.00353045 | 0 |
| 0.0035329 | 0 |
| 0.00353535 | 0 |
| 0.0035378 | 0 |
| 0.00354025 | 0 |
| 0.0035427 | 0 |
| 0.00354515 | 0 |
| 0.0035476 | 0 |
| 0.00355005 | 0 |
| 0.0035525 | 0 |
| 0.00355495 | 0 |
| 0.0035574 | 0 |
| 0.00355985 | 0 |
| 0.0035623 | 0 |
| 0.00356475 | 0 |
| 0.0035672 | 0 |
| 0.00356965 | 0 |
| 0.0035721 | 0 |
| 0.00357455 | 0 |
| 0.003577 | 0 |
| 0.00357945 | 0 |
| 0.0035819 | 0 |
| 0.00358435 | 0 |
| 0.0035868 | 0 |
| 0.00358925 | 0 |
| 0.0035917 | 0 |
| 0.00359415 | 0 |
| 0.0035966 | 0 |
| 0.00359905 | 0 |
| 0.0036015 | 0 |
| 0.00360395 | 0 |
| 0.0036064 | 0 |
| 0.00360885 | 0 |
| 0.0036113 | 0 |
| 0.00361375 | 0 |
| 0.0036162 | 0 |
| 0.00361865 | 0 |
| 0.0036211 | 0 |
| 0.00362355 | 0 |
| 0.003626 | 0 |
| 0.00362845 | 0 |
| 0.0036309 | 0 |
| 0.00363335 | 0 |
| 0.0036358 | 0 |
| 0.00363825 | 0 |
| 0.0036407 | 0 |
| 0.00364315 | 0 |
| 0.0036456 | 0 |
| 0.00364805 | 0 |
| 0.0036505 | 0 |
| 0.00365295 | 0 |
| 0.0036554 | 0 |
| 0.00365785 | 0 |
| 0.0036603 | 0 |
| 0.00366275 | 0 |
| 0.0036652 | 0 |
| 0.00366765 | 0 |
| 0.0036701 | 0 |
| 0.00367255 | 0 |
| 0.003675 | 0 |
| 0.00367745 | 0 |
| 0.0036799 | 0 |
| 0.00368235 | 0 |
| 0.0036848 | 0 |
| 0.00368725 | 0 |
| 0.0036897 | 0 |
| 0.00369215 | 0 |
| 0.0036946 | 0 |
| 0.00369705 | 0 |
| 0.0036995 | 0 |
| 0.00370195 | 0 |
| 0.0037044 | 0 |
| 0.00370685 | 0 |
| 0.0037093 | 0 |
| 0.00371175 | 0 |
| 0.0037142 | 0 |
| 0.00371665 | 0 |
| 0.0037191 | 0 |
| 0.00372155 | 0 |
| 0.003724 | 0 |
| 0.00372645 | 0 |
| 0.0037289 | 0 |
| 0.00373135 | 0 |
| 0.0037338 | 0 |
| 0.00373625 | 0 |
| 0.0037387 | 0 |
| 0.00374115 | 0 |
| 0.0037436 | 0 |
| 0.00374605 | 0 |
| 0.0037485 | 0 |
| 0.00375095 | 0 |
| 0.0037534 | 0 |
| 0.00375585 | 0 |
| 0.0037583 | 0 |
| 0.00376075 | 0 |
| 0.0037632 | 0 |
| 0.00376565 | 0 |
| 0.0037681 | 0 |
| 0.00377055 | 0 |
| 0.003773 | 0 |
| 0.00377545 | 0 |
| 0.0037779 | 0 |
| 0.00378035 | 0 |
| 0.0037828 | 0 |
| 0.00378525 | 0 |
| 0.0037877 | 0 |
| 0.00379015 | 0 |
| 0.0037926 | 0 |
| 0.00379505 | 0 |
| 0.0037975 | 0 |
| 0.00379995 | 0 |
| 0.0038024 | 0 |
| 0.00380485 | 0 |
| 0.0038073 | 0 |
| 0.00380975 | 0 |
| 0.0038122 | 0 |
| 0.00381465 | 0 |
| 0.0038171 | 0 |
| 0.00381955 | 0 |
| 0.003822 | 0 |
| 0.00382445 | 0 |
| 0.0038269 | 0 |
| 0.00382935 | 0 |
| 0.0038318 | 0 |
| 0.00383425 | 0 |
| 0.0038367 | 0 |
| 0.00383915 | 0 |
| 0.0038416 | 0 |
| 0.00384405 | 0 |
| 0.0038465 | 0 |
| 0.00384895 | 0 |
| 0.0038514 | 0 |
| 0.00385385 | 0 |
| 0.0038563 | 0 |
| 0.00385875 | 0 |
| 0.0038612 | 0 |
| 0.00386365 | 0 |
| 0.0038661 | 0 |
| 0.00386855 | 0 |
| 0.003871 | 0 |
| 0.00387345 | 0 |
| 0.0038759 | 0 |
| 0.00387835 | 0 |
| 0.0038808 | 0 |
| 0.00388325 | 0 |
| 0.0038857 | 0 |
| 0.00388815 | 0 |
| 0.0038906 | 0 |
| 0.00389305 | 0 |
| 0.0038955 | 0 |
| 0.00389795 | 0 |
| 0.0039004 | 0 |
| 0.00390285 | 0 |
| 0.0039053 | 0 |
| 0.00390775 | 0 |
| 0.0039102 | 0 |
| 0.00391265 | 0 |
| 0.0039151 | 0 |
| 0.00391755 | 0 |
| 0.00392 | 0 |
| 0.00392245 | 0 |
| 0.0039249 | 0 |
| 0.00392735 | 0 |
| 0.0039298 | 0 |
| 0.00393225 | 0 |
| 0.0039347 | 0 |
| 0.00393715 | 0 |
| 0.0039396 | 0 |
| 0.00394205 | 0 |
| 0.0039445 | 0 |
| 0.00394695 | 0 |
| 0.0039494 | 0 |
| 0.00395185 | 0 |
| 0.0039543 | 0 |
| 0.00395675 | 0 |
| 0.0039592 | 0 |
| 0.00396165 | 0 |
| 0.0039641 | 0 |
| 0.00396655 | 0 |
| 0.003969 | 0 |
| 0.00397145 | 0 |
| 0.0039739 | 0 |
| 0.00397635 | 0 |
| 0.0039788 | 0 |
| 0.00398125 | 0 |
| 0.0039837 | 0 |
| 0.00398615 | 0 |
| 0.0039886 | 0 |
| 0.00399105 | 0 |
| 0.0039935 | 0 |
| 0.00399595 | 0 |
| 0.0039984 | 0 |
| 0.00400085 | 0 |
| 0.0040033 | 0 |
| 0.00400575 | 0 |
| 0.0040082 | 0 |
| 0.00401065 | 0 |
| 0.0040131 | 0 |
| 0.00401555 | 0 |
| 0.004018 | 0 |
| 0.00402045 | 0 |
| 0.0040229 | 0 |
| 0.00402535 | 0 |
| 0.0040278 | 0 |
| 0.00403025 | 0 |
| 0.0040327 | 0 |
| 0.00403515 | 0 |
| 0.0040376 | 0 |
| 0.00404005 | 0 |
| 0.0040425 | 0 |
| 0.00404495 | 0 |
| 0.0040474 | 0 |
| 0.00404985 | 0 |
| 0.0040523 | 0 |
| 0.00405475 | 0 |
| 0.0040572 | 0 |
| 0.00405965 | 0 |
| 0.0040621 | 0 |
| 0.00406455 | 0 |
| 0.004067 | 0 |
| 0.00406945 | 0 |
| 0.0040719 | 0 |
| 0.00407435 | 0 |
| 0.0040768 | 0 |
| 0.00407925 | 0 |
| 0.0040817 | 0 |
| 0.00408415 | 0 |
| 0.0040866 | 0 |
| 0.00408905 | 0 |
| 0.0040915 | 0 |
| 0.00409395 | 0 |
| 0.0040964 | 0 |
| 0.00409885 | 0 |
| 0.0041013 | 0 |
| 0.00410375 | 0 |
| 0.0041062 | 0 |
| 0.00410865 | 0 |
| 0.0041111 | 0 |
| 0.00411355 | 0 |
| 0.004116 | 0 |
| 0.00411845 | 0 |
| 0.0041209 | 0 |
| 0.00412335 | 0 |
| 0.0041258 | 0 |
| 0.00412825 | 0 |
| 0.0041307 | 0 |
| 0.00413315 | 0 |
| 0.0041356 | 0 |
| 0.00413805 | 0 |
| 0.0041405 | 0 |
| 0.00414295 | 0 |
| 0.0041454 | 0 |
| 0.00414785 | 0 |
| 0.0041503 | 0 |
| 0.00415275 | 0 |
| 0.0041552 | 0 |
| 0.00415765 | 0 |
| 0.0041601 | 0 |
| 0.00416255 | 0 |
| 0.004165 | 0 |
| 0.00416745 | 0 |
| 0.0041699 | 0 |
| 0.00417235 | 0 |
| 0.0041748 | 0 |
| 0.00417725 | 0 |
| 0.0041797 | 0 |
| 0.00418215 | 0 |
| 0.0041846 | 0 |
| 0.00418705 | 0 |
| 0.0041895 | 0 |
| 0.00419195 | 0 |
| 0.0041944 | 0 |
| 0.00419685 | 0 |
| 0.0041993 | 0 |
| 0.00420175 | 0 |
| 0.0042042 | 0 |
| 0.00420665 | 0 |
| 0.0042091 | 0 |
| 0.00421155 | 0 |
| 0.004214 | 0 |
| 0.00421645 | 0 |
| 0.0042189 | 0 |
| 0.00422135 | 0 |
| 0.0042238 | 0 |
| 0.00422625 | 0 |
| 0.0042287 | 0 |
| 0.00423115 | 0 |
| 0.0042336 | 0 |
| 0.00423605 | 0 |
| 0.0042385 | 0 |
| 0.00424095 | 0 |
| 0.0042434 | 0 |
| 0.00424585 | 0 |
| 0.0042483 | 0 |
| 0.00425075 | 0 |
| 0.0042532 | 0 |
| 0.00425565 | 0 |
| 0.0042581 | 0 |
| 0.00426055 | 0 |
| 0.004263 | 0 |
| 0.00426545 | 0 |
| 0.0042679 | 0 |
| 0.00427035 | 0 |
| 0.0042728 | 0 |
| 0.00427525 | 0 |
| 0.0042777 | 0 |
| 0.00428015 | 0 |
| 0.0042826 | 0 |
| 0.00428505 | 0 |
| 0.0042875 | 0 |
| 0.00428995 | 0 |
| 0.0042924 | 0 |
| 0.00429485 | 0 |
| 0.0042973 | 0 |
| 0.00429975 | 0 |
| 0.0043022 | 0 |
| 0.00430465 | 0 |
| 0.0043071 | 0 |
| 0.00430955 | 0 |
| 0.004312 | 0 |
| 0.00431445 | 0 |
| 0.0043169 | 0 |
| 0.00431935 | 0 |
| 0.0043218 | 0 |
| 0.00432425 | 0 |
| 0.0043267 | 0 |
| 0.00432915 | 0 |
| 0.0043316 | 0 |
| 0.00433405 | 0 |
| 0.0043365 | 0 |
| 0.00433895 | 0 |
| 0.0043414 | 0 |
| 0.00434385 | 0 |
| 0.0043463 | 0 |
| 0.00434875 | 0 |
| 0.0043512 | 0 |
| 0.00435365 | 0 |
| 0.0043561 | 0 |
| 0.00435855 | 0 |
| 0.004361 | 0 |
| 0.00436345 | 0 |
| 0.0043659 | 0 |
| 0.00436835 | 0 |
| 0.0043708 | 0 |
| 0.00437325 | 0 |
| 0.0043757 | 0 |
| 0.00437815 | 0 |
| 0.0043806 | 0 |
| 0.00438305 | 0 |
| 0.0043855 | 0 |
| 0.00438795 | 0 |
| 0.0043904 | 0 |
| 0.00439285 | 0 |
| 0.0043953 | 0 |
| 0.00439775 | 0 |
| 0.0044002 | 0 |
| 0.00440265 | 0 |
| 0.0044051 | 0 |
| 0.00440755 | 0 |
| 0.00441 | 0 |
| 0.00441245 | 0 |
| 0.0044149 | 0 |
| 0.00441735 | 0 |
| 0.0044198 | 0 |
| 0.00442225 | 0 |
| 0.0044247 | 0 |
| 0.00442715 | 0 |
| 0.0044296 | 0 |
| 0.00443205 | 0 |
| 0.0044345 | 0 |
| 0.00443695 | 0 |
| 0.0044394 | 0 |
| 0.00444185 | 0 |
| 0.0044443 | 0 |
| 0.00444675 | 0 |
| 0.0044492 | 0 |
| 0.00445165 | 0 |
| 0.0044541 | 0 |
| 0.00445655 | 0 |
| 0.004459 | 0 |
| 0.00446145 | 0 |
| 0.0044639 | 0 |
| 0.00446635 | 0 |
| 0.0044688 | 0 |
| 0.00447125 | 0 |
| 0.0044737 | 0 |
| 0.00447615 | 0 |
| 0.0044786 | 0 |
| 0.00448105 | 0 |
| 0.0044835 | 0 |
| 0.00448595 | 0 |
| 0.0044884 | 0 |
| 0.00449085 | 0 |
| 0.0044933 | 0 |
| 0.00449575 | 0 |
| 0.0044982 | 0 |
| 0.00450065 | 0 |
| 0.0045031 | 0 |
| 0.00450555 | 0 |
| 0.004508 | 0 |
| 0.00451045 | 0 |
| 0.0045129 | 0 |
| 0.00451535 | 0 |
| 0.0045178 | 0 |
| 0.00452025 | 0 |
| 0.0045227 | 0 |
| 0.00452515 | 0 |
| 0.0045276 | 0 |
| 0.00453005 | 0 |
| 0.0045325 | 0 |
| 0.00453495 | 0 |
| 0.0045374 | 0 |
| 0.00453985 | 0 |
| 0.0045423 | 0 |
| 0.00454475 | 0 |
| 0.0045472 | 0 |
| 0.00454965 | 0 |
| 0.0045521 | 0 |
| 0.00455455 | 0 |
| 0.004557 | 0 |
| 0.00455945 | 0 |
| 0.0045619 | 0 |
| 0.00456435 | 0 |
| 0.0045668 | 0 |
| 0.00456925 | 0 |
| 0.0045717 | 0 |
| 0.00457415 | 0 |
| 0.0045766 | 0 |
| 0.00457905 | 0 |
| 0.0045815 | 0 |
| 0.00458395 | 0 |
| 0.0045864 | 0 |
| 0.00458885 | 0 |
| 0.0045913 | 0 |
| 0.00459375 | 0 |
| 0.0045962 | 0 |
| 0.00459865 | 0 |
| 0.0046011 | 0 |
| 0.00460355 | 0 |
| 0.004606 | 0 |
| 0.00460845 | 0 |
| 0.0046109 | 0 |
| 0.00461335 | 0 |
| 0.0046158 | 0 |
| 0.00461825 | 0 |
| 0.0046207 | 0 |
| 0.00462315 | 0 |
| 0.0046256 | 0 |
| 0.00462805 | 0 |
| 0.0046305 | 0 |
| 0.00463295 | 0 |
| 0.0046354 | 0 |
| 0.00463785 | 0 |
| 0.0046403 | 0 |
| 0.00464275 | 0 |
| 0.0046452 | 0 |
| 0.00464765 | 0 |
| 0.0046501 | 0 |
| 0.00465255 | 0 |
| 0.004655 | 0 |
| 0.00465745 | 0 |
| 0.0046599 | 0 |
| 0.00466235 | 0 |
| 0.0046648 | 0 |
| 0.00466725 | 0 |
| 0.0046697 | 0 |
| 0.00467215 | 0 |
| 0.0046746 | 0 |
| 0.00467705 | 0 |
| 0.0046795 | 0 |
| 0.00468195 | 0 |
| 0.0046844 | 0 |
| 0.00468685 | 0 |
| 0.0046893 | 0 |
| 0.00469175 | 0 |
| 0.0046942 | 0 |
| 0.00469665 | 0 |
| 0.0046991 | 0 |
| 0.00470155 | 0 |
| 0.004704 | 0 |
| 0.00470645 | 0 |
| 0.0047089 | 0 |
| 0.00471135 | 0 |
| 0.0047138 | 0 |
| 0.00471625 | 0 |
| 0.0047187 | 0 |
| 0.00472115 | 0 |
| 0.0047236 | 0 |
| 0.00472605 | 0 |
| 0.0047285 | 0 |
| 0.00473095 | 0 |
| 0.0047334 | 0 |
| 0.00473585 | 0 |
| 0.0047383 | 0 |
| 0.00474075 | 0 |
| 0.0047432 | 0 |
| 0.00474565 | 0 |
| 0.0047481 | 0 |
| 0.00475055 | 0 |
| 0.004753 | 0 |
| 0.00475545 | 0 |
| 0.0047579 | 0 |
| 0.00476035 | 0 |
| 0.0047628 | 0 |
| 0.00476525 | 0 |
| 0.0047677 | 0 |
| 0.00477015 | 0 |
| 0.0047726 | 0 |
| 0.00477505 | 0 |
| 0.0047775 | 0 |
| 0.00477995 | 0 |
| 0.0047824 | 0 |
| 0.00478485 | 0 |
| 0.0047873 | 0 |
| 0.00478975 | 0 |
| 0.0047922 | 0 |
| 0.00479465 | 0 |
| 0.0047971 | 0 |
| 0.00479955 | 0 |
| 0.004802 | 0 |
| 0.00480445 | 0 |
| 0.0048069 | 0 |
| 0.00480935 | 0 |
| 0.0048118 | 0 |
| 0.00481425 | 0 |
| 0.0048167 | 0 |
| 0.00481915 | 0 |
| 0.0048216 | 0 |
| 0.00482405 | 0 |
| 0.0048265 | 0 |
| 0.00482895 | 0 |
| 0.0048314 | 0 |
| 0.00483385 | 0 |
| 0.0048363 | 0 |
| 0.00483875 | 0 |
| 0.0048412 | 0 |
| 0.00484365 | 0 |
| 0.0048461 | 0 |
| 0.00484855 | 0 |
| 0.004851 | 0 |
| 0.00485345 | 0 |
| 0.0048559 | 0 |
| 0.00485835 | 0 |
| 0.0048608 | 0 |
| 0.00486325 | 0 |
| 0.0048657 | 0 |
| 0.00486815 | 0 |
| 0.0048706 | 0 |
| 0.00487305 | 0 |
| 0.0048755 | 0 |
| 0.00487795 | 0 |
| 0.0048804 | 0 |
| 0.00488285 | 0 |
| 0.0048853 | 0 |
| 0.00488775 | 0 |
| 0.0048902 | 0 |
| 0.00489265 | 0 |
| 0.0048951 | 0 |
| 0.00489755 | 0 |
| 0.0049 | 0 |
| 0.00490245 | 0 |
| 0.0049049 | 0 |
| 0.00490735 | 0 |
| 0.0049098 | 0 |
| 0.00491225 | 0 |
| 0.0049147 | 0 |
| 0.00491715 | 0 |
| 0.0049196 | 0 |
| 0.00492205 | 0 |
| 0.0049245 | 0 |
| 0.00492695 | 0 |
| 0.0049294 | 0 |
| 0.00493185 | 0 |
| 0.0049343 | 0 |
| 0.00493675 | 0 |
| 0.0049392 | 0 |
| 0.00494165 | 0 |
| 0.0049441 | 0 |
| 0.00494655 | 0 |
| 0.004949 | 0 |
| 0.00495145 | 0 |
| 0.0049539 | 0 |
| 0.00495635 | 0 |
| 0.0049588 | 0 |
| 0.00496125 | 0 |
| 0.0049637 | 0 |
| 0.00496615 | 0 |
| 0.0049686 | 0 |
| 0.00497105 | 0 |
| 0.0049735 | 0 |
| 0.00497595 | 0 |
| 0.0049784 | 0 |
| 0.00498085 | 0 |
| 0.0049833 | 0 |
| 0.00498575 | 0 |
| 0.0049882 | 0 |
| 0.00499065 | 0 |
| 0.0049931 | 0 |
| 0.00499555 | 0 |